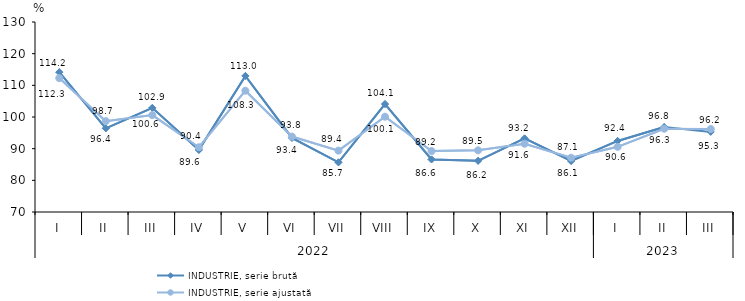
| Category | INDUSTRIE, serie brută | INDUSTRIE, serie ajustată |
|---|---|---|
| 0 | 114.151 | 112.283 |
| 1 | 96.419 | 98.68 |
| 2 | 102.886 | 100.594 |
| 3 | 89.614 | 90.447 |
| 4 | 112.973 | 108.294 |
| 5 | 93.417 | 93.82 |
| 6 | 85.678 | 89.372 |
| 7 | 104.099 | 100.102 |
| 8 | 86.603 | 89.228 |
| 9 | 86.164 | 89.466 |
| 10 | 93.241 | 91.558 |
| 11 | 86.103 | 87.134 |
| 12 | 92.442 | 90.58 |
| 13 | 96.83 | 96.297 |
| 14 | 95.296 | 96.196 |